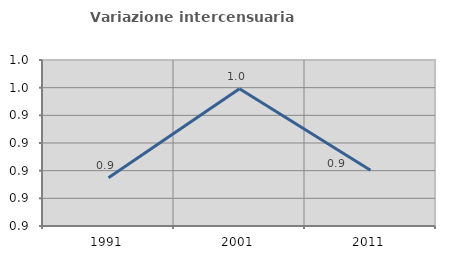
| Category | Variazione intercensuaria annua |
|---|---|
| 1991.0 | 0.895 |
| 2001.0 | 0.959 |
| 2011.0 | 0.9 |